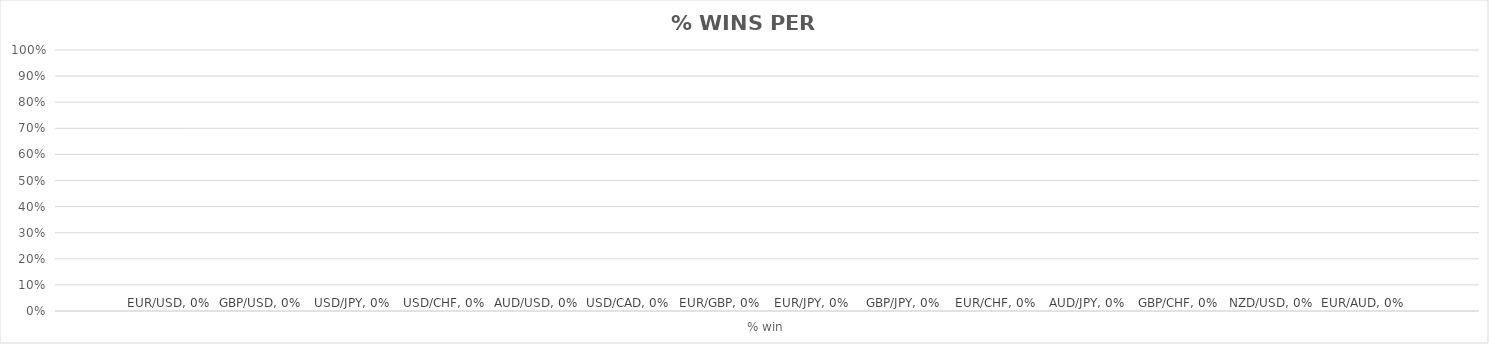
| Category | EUR/USD | GBP/USD | USD/JPY | USD/CHF | AUD/USD | USD/CAD | EUR/GBP | EUR/JPY | GBP/JPY | EUR/CHF | AUD/JPY | GBP/CHF | NZD/USD | EUR/AUD |
|---|---|---|---|---|---|---|---|---|---|---|---|---|---|---|
| % win | 0 | 0 | 0 | 0 | 0 | 0 | 0 | 0 | 0 | 0 | 0 | 0 | 0 | 0 |